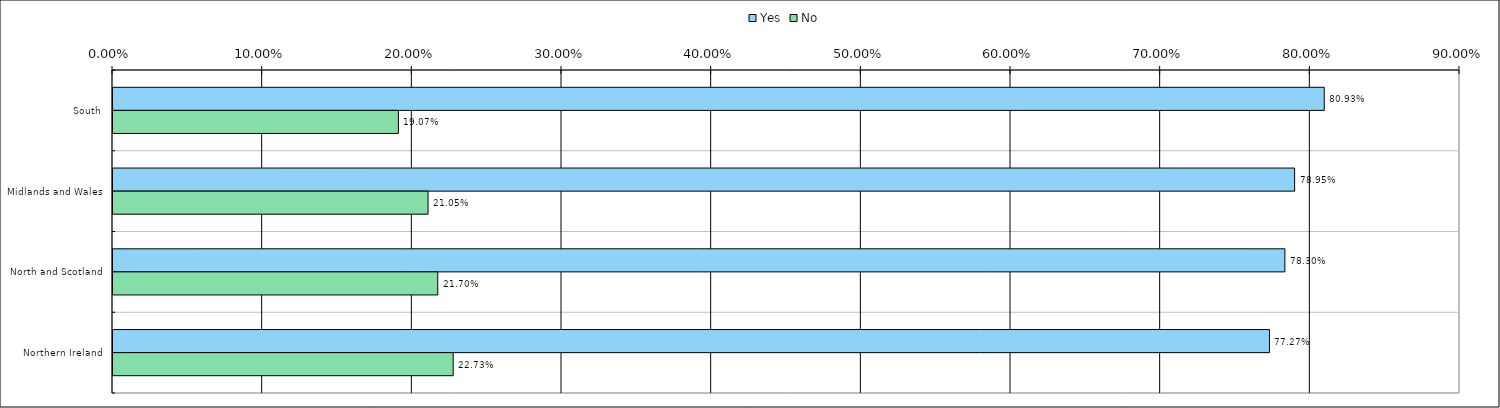
| Category | Yes | No |
|---|---|---|
| 0 | 0.809 | 0.191 |
| 1 | 0.79 | 0.21 |
| 2 | 0.783 | 0.217 |
| 3 | 0.773 | 0.227 |